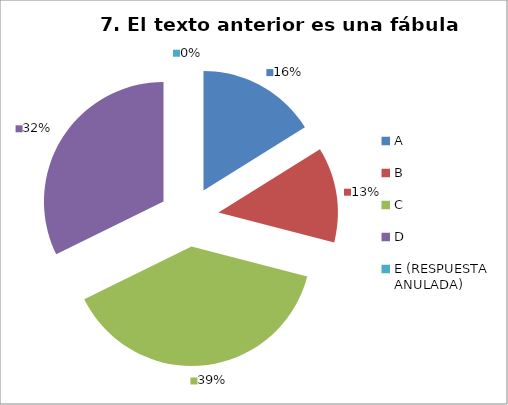
| Category | CANTIDAD DE RESPUESTAS PREGUNTA (7) | PORCENTAJE |
|---|---|---|
| A | 5 | 0.161 |
| B | 4 | 0.129 |
| C | 12 | 0.387 |
| D | 10 | 0.323 |
| E (RESPUESTA ANULADA) | 0 | 0 |